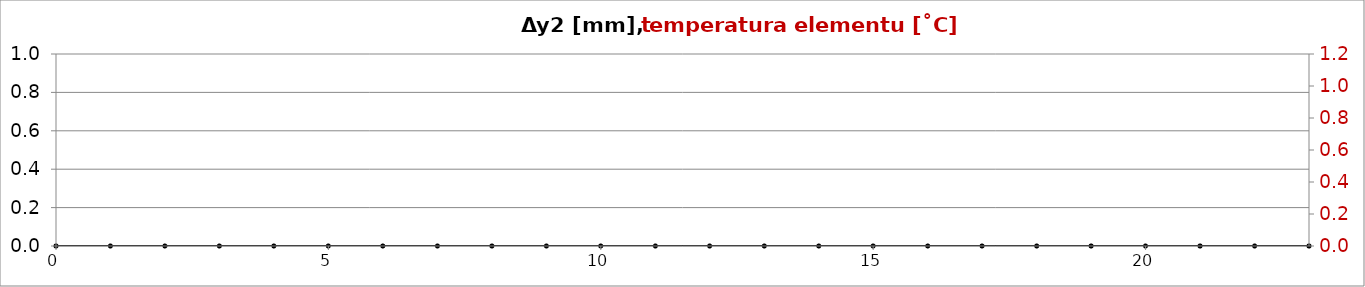
| Category | dy2 |
|---|---|
| 0.0 | 0 |
| 1.0 | 0 |
| 2.0 | 0 |
| 3.0 | 0 |
| 4.0 | 0 |
| 5.0 | 0 |
| 6.0 | 0 |
| 7.0 | 0 |
| 8.0 | 0 |
| 9.0 | 0 |
| 10.0 | 0 |
| 11.0 | 0 |
| 12.0 | 0 |
| 13.0 | 0 |
| 14.0 | 0 |
| 15.0 | 0 |
| 16.0 | 0 |
| 17.0 | 0 |
| 18.0 | 0 |
| 19.0 | 0 |
| 20.0 | 0 |
| 21.0 | 0 |
| 22.0 | 0 |
| 23.0 | 0 |